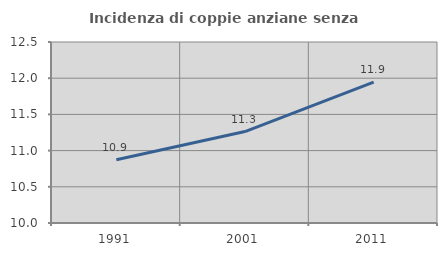
| Category | Incidenza di coppie anziane senza figli  |
|---|---|
| 1991.0 | 10.874 |
| 2001.0 | 11.263 |
| 2011.0 | 11.946 |